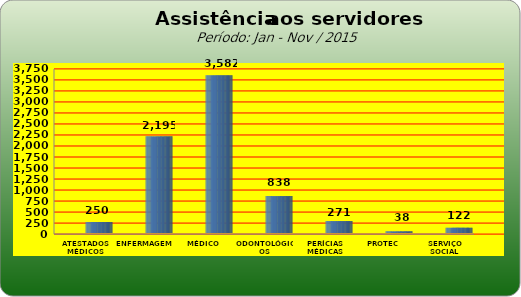
| Category | Series 0 |
|---|---|
| ATESTADOS MÉDICOS | 250 |
| ENFERMAGEM | 2195 |
| MÉDICO | 3582 |
| ODONTOLÓGICOS | 838 |
| PERÍCIAS MÉDICAS | 271 |
| PROTEC | 38 |
| SERVIÇO SOCIAL | 122 |